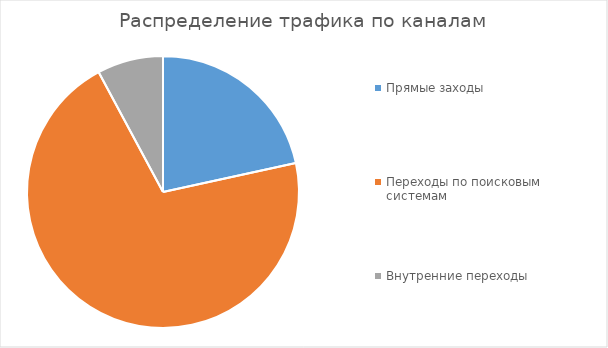
| Category | Series 0 |
|---|---|
| Прямые заходы | 11 |
| Переходы по поисковым системам | 36 |
| Внутренние переходы | 4 |